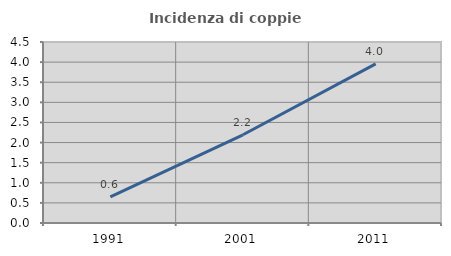
| Category | Incidenza di coppie miste |
|---|---|
| 1991.0 | 0.649 |
| 2001.0 | 2.193 |
| 2011.0 | 3.956 |